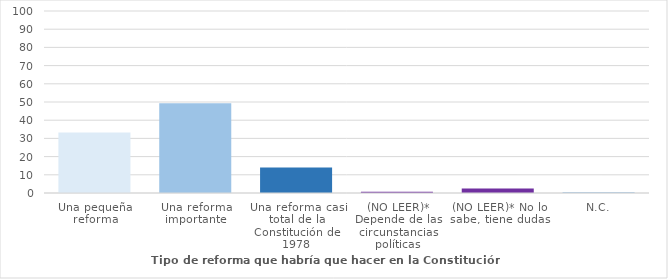
| Category | Series 0 |
|---|---|
| Una pequeña reforma | 33.2 |
| Una reforma importante | 49.3 |
| Una reforma casi total de la Constitución de 1978 | 14 |
| (NO LEER)* Depende de las circunstancias políticas | 0.7 |
| (NO LEER)* No lo sabe, tiene dudas | 2.5 |
| N.C. | 0.3 |